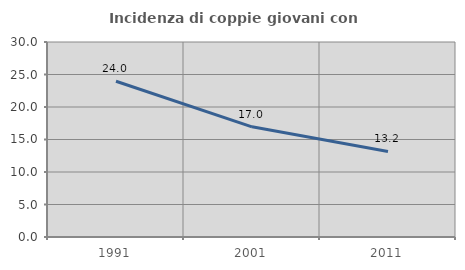
| Category | Incidenza di coppie giovani con figli |
|---|---|
| 1991.0 | 23.961 |
| 2001.0 | 16.953 |
| 2011.0 | 13.163 |